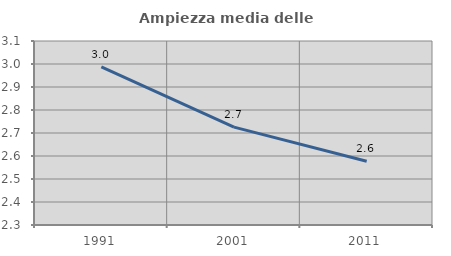
| Category | Ampiezza media delle famiglie |
|---|---|
| 1991.0 | 2.988 |
| 2001.0 | 2.726 |
| 2011.0 | 2.577 |